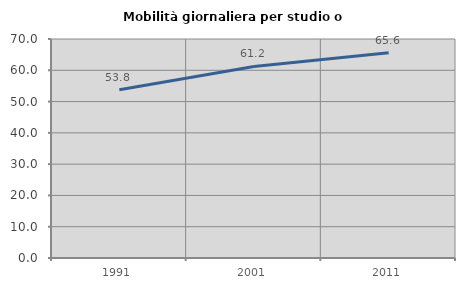
| Category | Mobilità giornaliera per studio o lavoro |
|---|---|
| 1991.0 | 53.772 |
| 2001.0 | 61.24 |
| 2011.0 | 65.585 |